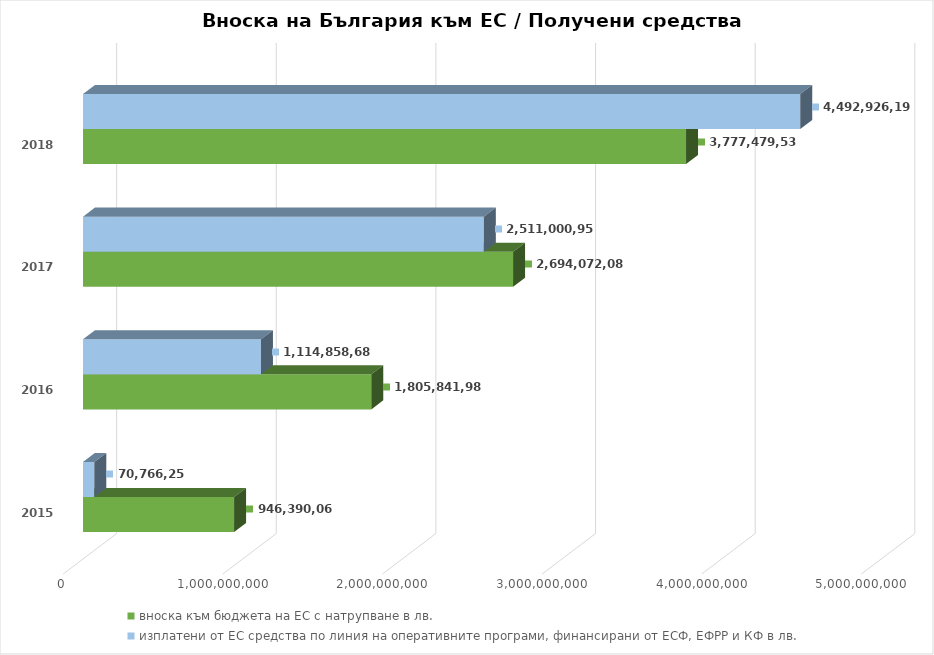
| Category | вноска към бюджета на ЕС с натрупване в лв. | изплатени от ЕС средства по линия на оперативните програми, финансирани от ЕСФ, ЕФРР и КФ в лв.  |
|---|---|---|
| 2015.0 | 946390066 | 70766255.696 |
| 2016.0 | 1805841984 | 1114858686.327 |
| 2017.0 | 2694072087 | 2511000951.152 |
| 2018.0 | 3777479532 | 4492926194.379 |